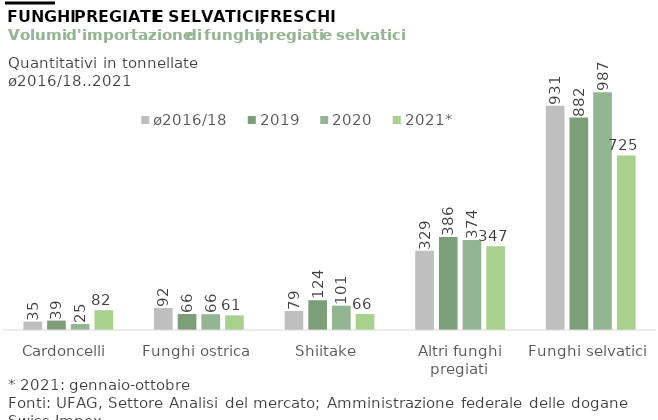
| Category | ø2016/18 | 2019 | 2020 | 2021* |
|---|---|---|---|---|
| Cardoncelli | 34.888 | 39.131 | 24.71 | 82.24 |
| Funghi ostrica | 91.698 | 66.388 | 65.534 | 60.713 |
| Shiitake | 78.946 | 123.637 | 101.028 | 66.157 |
| Altri funghi pregiati | 329.026 | 385.705 | 373.844 | 347.417 |
| Funghi selvatici | 931.092 | 881.945 | 987.455 | 724.644 |